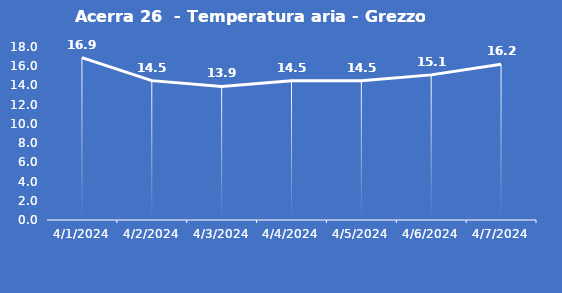
| Category | Acerra 26  - Temperatura aria - Grezzo (°C) |
|---|---|
| 4/1/24 | 16.9 |
| 4/2/24 | 14.5 |
| 4/3/24 | 13.9 |
| 4/4/24 | 14.5 |
| 4/5/24 | 14.5 |
| 4/6/24 | 15.1 |
| 4/7/24 | 16.2 |